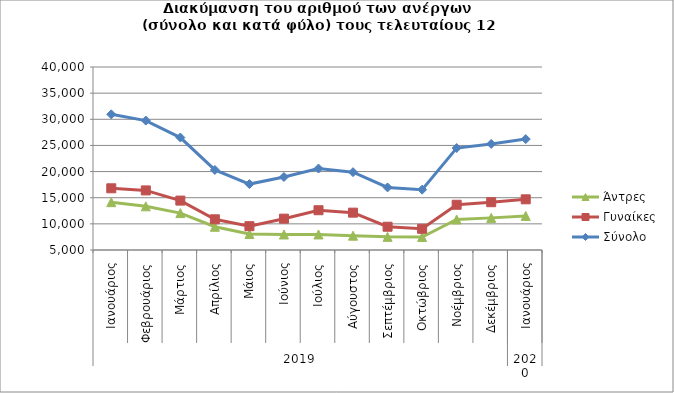
| Category | Άντρες | Γυναίκες | Σύνολο |
|---|---|---|---|
| 0 | 14150 | 16801 | 30951 |
| 1 | 13355 | 16396 | 29751 |
| 2 | 12061 | 14447 | 26508 |
| 3 | 9443 | 10872 | 20315 |
| 4 | 8053 | 9554 | 17607 |
| 5 | 7968 | 10992 | 18960 |
| 6 | 7975 | 12607 | 20582 |
| 7 | 7739 | 12144 | 19883 |
| 8 | 7518 | 9450 | 16968 |
| 9 | 7491 | 9053 | 16544 |
| 10 | 10842 | 13653 | 24495 |
| 11 | 11144 | 14141 | 25285 |
| 12 | 11522 | 14692 | 26214 |